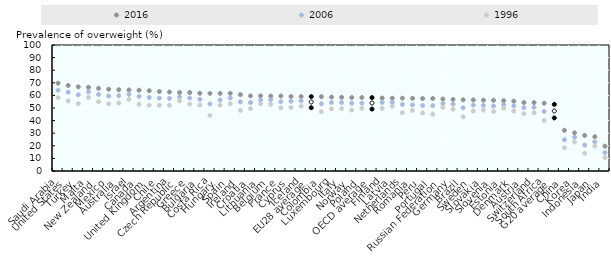
| Category | 2016 | 2006 | 1996 |
|---|---|---|---|
| Saudi Arabia | 69.7 | 64.1 | 58.3 |
| United States | 67.9 | 62.5 | 55.6 |
| Turkey | 66.8 | 60.5 | 53.5 |
| Malta | 66.4 | 62.8 | 58.4 |
| New Zealand | 65.6 | 60.7 | 54.9 |
| Mexico | 64.9 | 59.5 | 53.3 |
| Australia | 64.5 | 59.7 | 53.9 |
| Israel | 64.3 | 60.9 | 56.9 |
| Canada | 64.1 | 59.2 | 53 |
| United Kingdom | 63.7 | 58.4 | 52.3 |
| Chile | 63.1 | 57.8 | 52.2 |
| Argentina | 62.7 | 57.6 | 52.2 |
| Czech Republic | 62.3 | 58.8 | 55.7 |
| Greece | 62.3 | 57.9 | 53.1 |
| Bulgaria | 61.7 | 56.9 | 52.3 |
| Costa Rica | 61.6 | 53.2 | 44.1 |
| Hungary | 61.6 | 56.3 | 52.3 |
| Spain | 61.6 | 57.9 | 53.4 |
| Ireland | 60.6 | 54.8 | 48.1 |
| Croatia | 59.6 | 54.3 | 49.5 |
| Lithuania | 59.6 | 56.3 | 53.3 |
| Belgium | 59.5 | 56.6 | 52.9 |
| France | 59.5 | 55 | 50.1 |
| Cyprus | 59.1 | 55.3 | 50.4 |
| Iceland | 59.1 | 55.7 | 51.5 |
| EU28 average | 59.025 | 54.757 | 50.221 |
| Colombia | 59 | 53.3 | 47.1 |
| Luxembourg | 58.7 | 54.4 | 49.3 |
| Italy | 58.5 | 54.3 | 49.5 |
| Norway | 58.3 | 53.8 | 48.3 |
| Poland | 58.3 | 53.8 | 49.7 |
| OECD average | 58.294 | 53.947 | 49.153 |
| Finland | 57.9 | 54.4 | 49.8 |
| Latvia | 57.8 | 54.4 | 51.5 |
| Netherlands | 57.8 | 52.8 | 46.3 |
| Romania | 57.7 | 52.5 | 48.1 |
| Peru | 57.5 | 51.9 | 46 |
| Portugal | 57.5 | 51.8 | 45.1 |
| Russian Federation | 57.1 | 53.5 | 50.5 |
| Germany | 56.8 | 53.1 | 49.1 |
| Brazil | 56.5 | 50.2 | 43 |
| Sweden | 56.4 | 52.3 | 47.6 |
| Slovakia | 56.2 | 52.1 | 48.3 |
| Slovenia | 56.1 | 51.6 | 47.2 |
| Estonia | 55.8 | 52.5 | 49.8 |
| Denmark | 55.4 | 51.7 | 47.6 |
| Austria | 54.3 | 50.2 | 45.5 |
| Switzerland | 54.3 | 50.5 | 46.1 |
| South Africa | 53.8 | 47.2 | 40.1 |
| G20 average | 52.853 | 47.611 | 42.126 |
| China | 32.3 | 24.8 | 18.5 |
| Korea | 30.3 | 26.8 | 23 |
| Indonesia | 28.2 | 20.5 | 14 |
| Japan | 27.2 | 23.1 | 19.8 |
| India | 19.7 | 14.6 | 10.7 |